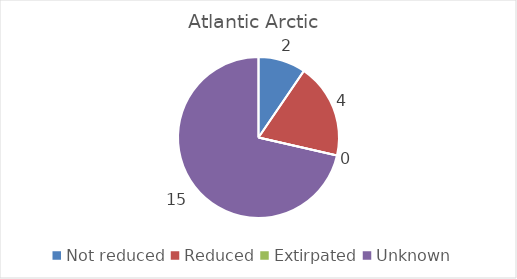
| Category | Atlantic Arctic |
|---|---|
| Not reduced | 2 |
| Reduced | 4 |
| Extirpated | 0 |
| Unknown | 15 |